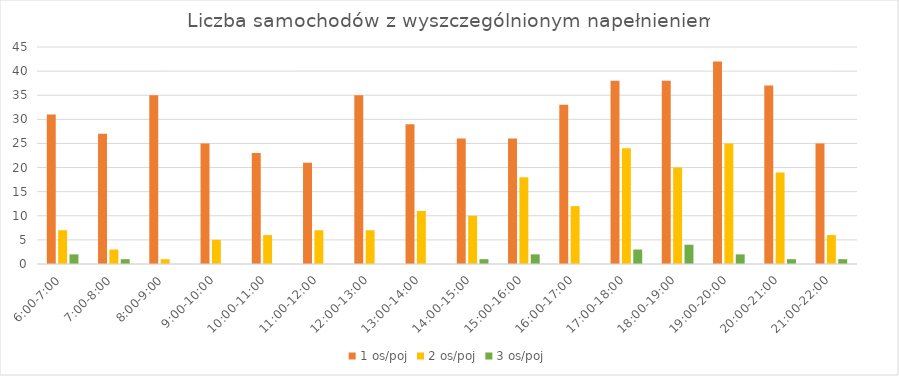
| Category | 1 os/poj | 2 os/poj | 3 os/poj |
|---|---|---|---|
| 6:00-7:00 | 31 | 7 | 2 |
| 7:00-8:00 | 27 | 3 | 1 |
| 8:00-9:00 | 35 | 1 | 0 |
| 9:00-10:00 | 25 | 5 | 0 |
| 10:00-11:00 | 23 | 6 | 0 |
| 11:00-12:00 | 21 | 7 | 0 |
| 12:00-13:00 | 35 | 7 | 0 |
| 13:00-14:00 | 29 | 11 | 0 |
| 14:00-15:00 | 26 | 10 | 1 |
| 15:00-16:00 | 26 | 18 | 2 |
| 16:00-17:00 | 33 | 12 | 0 |
| 17:00-18:00 | 38 | 24 | 3 |
| 18:00-19:00 | 38 | 20 | 4 |
| 19:00-20:00 | 42 | 25 | 2 |
| 20:00-21:00 | 37 | 19 | 1 |
| 21:00-22:00 | 25 | 6 | 1 |